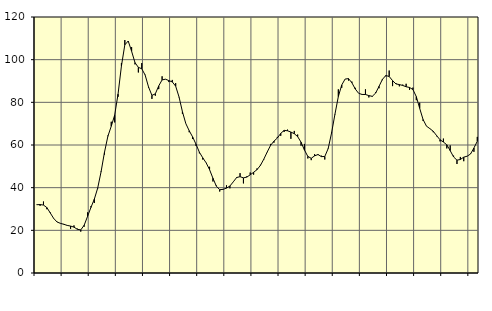
| Category | Piggar | Series 1 |
|---|---|---|
| nan | 31.9 | 32 |
| 87.0 | 31.5 | 32.09 |
| 87.0 | 33.5 | 31.84 |
| 87.0 | 29.9 | 30.66 |
| nan | 28.4 | 28.16 |
| 88.0 | 25.5 | 25.61 |
| 88.0 | 24 | 23.91 |
| 88.0 | 23.2 | 23.28 |
| nan | 23 | 22.83 |
| 89.0 | 22.2 | 22.31 |
| 89.0 | 20.7 | 22 |
| 89.0 | 22.3 | 21.5 |
| nan | 20.8 | 20.48 |
| 90.0 | 19.4 | 20.21 |
| 90.0 | 21.7 | 22.38 |
| 90.0 | 28.4 | 26.5 |
| nan | 31.3 | 30.73 |
| 91.0 | 32.8 | 34.6 |
| 91.0 | 39.6 | 39.81 |
| 91.0 | 47.7 | 47.47 |
| nan | 55.5 | 56.57 |
| 92.0 | 64.4 | 64.08 |
| 92.0 | 70.9 | 68.8 |
| 92.0 | 70.6 | 73.96 |
| nan | 82.6 | 83.82 |
| 93.0 | 98.4 | 97.02 |
| 93.0 | 109.2 | 106.95 |
| 93.0 | 108.5 | 108.73 |
| nan | 105.9 | 103.95 |
| 94.0 | 97.8 | 98.62 |
| 94.0 | 94 | 96.4 |
| 94.0 | 98.4 | 95.74 |
| nan | 92.9 | 92.78 |
| 95.0 | 86.9 | 87.21 |
| 95.0 | 81.6 | 83.26 |
| 95.0 | 83.1 | 83.99 |
| nan | 86.2 | 87.69 |
| 96.0 | 92.2 | 90.52 |
| 96.0 | 90.9 | 90.85 |
| 96.0 | 89.5 | 90.18 |
| nan | 90.5 | 89.58 |
| 97.0 | 89 | 87.57 |
| 97.0 | 82.4 | 82.52 |
| 97.0 | 74.6 | 75.61 |
| nan | 70 | 70.04 |
| 98.0 | 66 | 66.68 |
| 98.0 | 62.8 | 63.81 |
| 98.0 | 59.6 | 60.38 |
| nan | 56.1 | 56.63 |
| 99.0 | 53.2 | 53.98 |
| 99.0 | 51.7 | 51.64 |
| 99.0 | 49.8 | 48.45 |
| nan | 42.9 | 44.41 |
| 0.0 | 41 | 40.71 |
| 0.0 | 38.2 | 39.05 |
| 0.0 | 39.4 | 39.2 |
| nan | 41.1 | 39.79 |
| 1.0 | 39.7 | 40.76 |
| 1.0 | 42.7 | 42.72 |
| 1.0 | 45 | 44.76 |
| nan | 46.8 | 45.15 |
| 2.0 | 42 | 44.59 |
| 2.0 | 45.3 | 44.95 |
| 2.0 | 47.1 | 46.03 |
| nan | 46.1 | 47.2 |
| 3.0 | 49 | 48.44 |
| 3.0 | 50.7 | 50.41 |
| 3.0 | 53.1 | 53.33 |
| nan | 56.6 | 56.67 |
| 4.0 | 60.5 | 59.82 |
| 4.0 | 61.1 | 61.79 |
| 4.0 | 63.8 | 63.26 |
| nan | 64.3 | 65.44 |
| 5.0 | 66.1 | 66.86 |
| 5.0 | 67.2 | 66.67 |
| 5.0 | 62.9 | 66.06 |
| nan | 66.6 | 65.3 |
| 6.0 | 64.9 | 63.93 |
| 6.0 | 59.7 | 61.31 |
| 6.0 | 60.5 | 57.65 |
| nan | 53.7 | 54.65 |
| 7.0 | 52.9 | 53.77 |
| 7.0 | 55.7 | 54.91 |
| 7.0 | 55.3 | 55.53 |
| nan | 55 | 54.56 |
| 8.0 | 53.2 | 54.61 |
| 8.0 | 58.5 | 58.33 |
| 8.0 | 65.9 | 65.66 |
| nan | 74.3 | 74.46 |
| 9.0 | 86.1 | 82.71 |
| 9.0 | 86.8 | 88.13 |
| 9.0 | 90.9 | 90.91 |
| nan | 90.2 | 91.11 |
| 10.0 | 89.7 | 89.17 |
| 10.0 | 86.8 | 86.23 |
| 10.0 | 84.2 | 84.21 |
| nan | 83.6 | 83.7 |
| 11.0 | 86.1 | 83.67 |
| 11.0 | 82.3 | 83.16 |
| 11.0 | 82.6 | 82.81 |
| nan | 84.7 | 84.33 |
| 12.0 | 86.6 | 87.48 |
| 12.0 | 90.4 | 90.74 |
| 12.0 | 92.2 | 92.57 |
| nan | 94.9 | 92.12 |
| 13.0 | 87.6 | 90.18 |
| 13.0 | 89 | 88.63 |
| 13.0 | 87.5 | 88.33 |
| nan | 88.3 | 87.91 |
| 14.0 | 88.7 | 87.3 |
| 14.0 | 85.8 | 86.97 |
| 14.0 | 86.9 | 86 |
| nan | 81 | 82.68 |
| 15.0 | 79.8 | 77.2 |
| 15.0 | 71.3 | 71.94 |
| 15.0 | 68.8 | 68.85 |
| nan | 67.6 | 67.68 |
| 16.0 | 66 | 66.44 |
| 16.0 | 64.1 | 64.4 |
| 16.0 | 61.7 | 62.46 |
| nan | 63 | 61.39 |
| 17.0 | 58.4 | 60.1 |
| 17.0 | 59.8 | 57.36 |
| 17.0 | 55 | 54.4 |
| nan | 51.1 | 52.89 |
| 18.0 | 54.4 | 53.21 |
| 18.0 | 52.4 | 54.3 |
| 18.0 | 54.7 | 54.75 |
| nan | 55.9 | 55.77 |
| 19.0 | 56.8 | 58.6 |
| 19.0 | 63.8 | 61.76 |